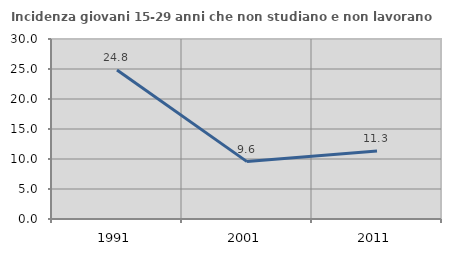
| Category | Incidenza giovani 15-29 anni che non studiano e non lavorano  |
|---|---|
| 1991.0 | 24.823 |
| 2001.0 | 9.566 |
| 2011.0 | 11.314 |